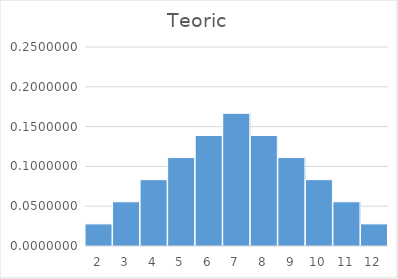
| Category | Teoric |
|---|---|
| 2.0 | 0.028 |
| 3.0 | 0.056 |
| 4.0 | 0.083 |
| 5.0 | 0.111 |
| 6.0 | 0.139 |
| 7.0 | 0.167 |
| 8.0 | 0.139 |
| 9.0 | 0.111 |
| 10.0 | 0.083 |
| 11.0 | 0.056 |
| 12.0 | 0.028 |